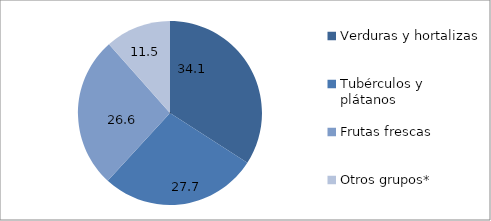
| Category | Abastecimiento mensual Bogotá |
|---|---|
| Verduras y hortalizas  | 34.111 |
| Tubérculos y plátanos  | 27.726 |
| Frutas frescas  | 26.615 |
| Otros grupos* | 11.548 |